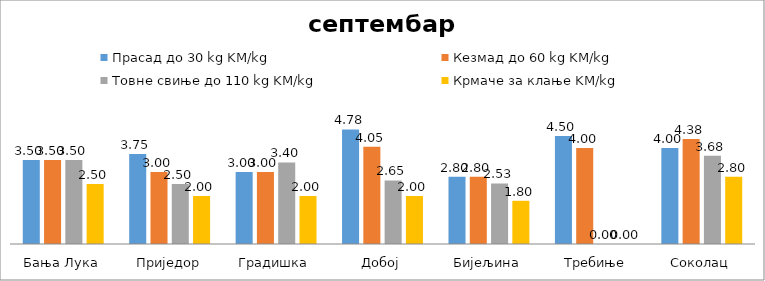
| Category | Прасад до 30 kg KM/kg | Кезмад до 60 kg KM/kg | Товне свиње до 110 kg KM/kg | Крмаче за клање KM/kg |
|---|---|---|---|---|
| Бања Лука | 3.5 | 3.5 | 3.5 | 2.5 |
| Приједор | 3.75 | 3 | 2.5 | 2 |
| Градишка | 3 | 3 | 3.4 | 2 |
| Добој | 4.775 | 4.05 | 2.65 | 2 |
| Бијељина | 2.8 | 2.8 | 2.525 | 1.8 |
|  Требиње | 4.5 | 4 | 0 | 0 |
| Соколац | 4 | 4.375 | 3.675 | 2.8 |